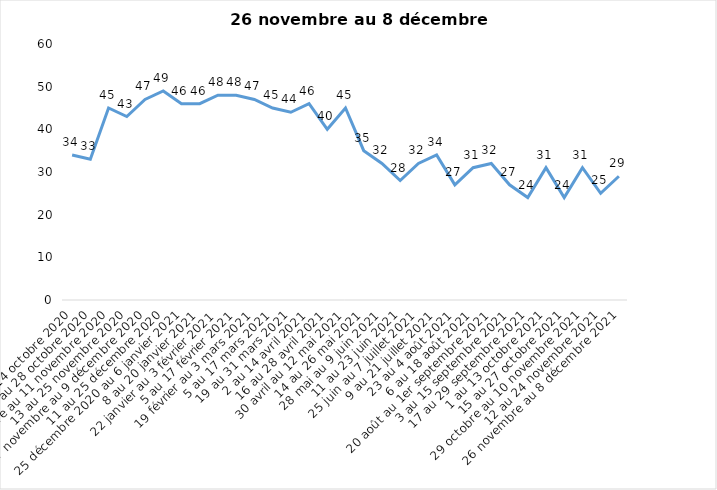
| Category | Toujours aux trois mesures |
|---|---|
| 2 au 14 octobre 2020 | 34 |
| 16 au 28 octobre 2020 | 33 |
| 30 octobre au 11 novembre 2020 | 45 |
| 13 au 25 novembre 2020 | 43 |
| 27 novembre au 9 décembre 2020 | 47 |
| 11 au 25 décembre 2020 | 49 |
| 25 décembre 2020 au 6 janvier 2021 | 46 |
| 8 au 20 janvier 2021 | 46 |
| 22 janvier au 3 février 2021 | 48 |
| 5 au 17 février 2021 | 48 |
| 19 février au 3 mars 2021 | 47 |
| 5 au 17 mars 2021 | 45 |
| 19 au 31 mars 2021 | 44 |
| 2 au 14 avril 2021 | 46 |
| 16 au 28 avril 2021 | 40 |
| 30 avril au 12 mai 2021 | 45 |
| 14 au 26 mai 2021 | 35 |
| 28 mai au 9 juin 2021 | 32 |
| 11 au 23 juin 2021 | 28 |
| 25 juin au 7 juillet 2021 | 32 |
| 9 au 21 juillet 2021 | 34 |
| 23 au 4 août 2021 | 27 |
| 6 au 18 août 2021 | 31 |
| 20 août au 1er septembre 2021 | 32 |
| 3 au 15 septembre 2021 | 27 |
| 17 au 29 septembre 2021 | 24 |
| 1 au 13 octobre 2021 | 31 |
| 15 au 27 octobre 2021 | 24 |
| 29 octobre au 10 novembre 2021 | 31 |
| 12 au 24 novembre 2021 | 25 |
| 26 novembre au 8 décembre 2021 | 29 |